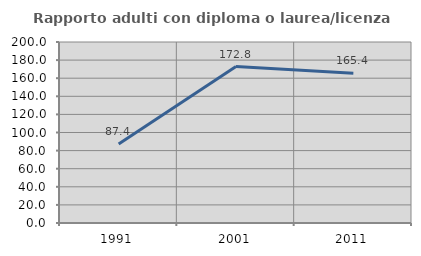
| Category | Rapporto adulti con diploma o laurea/licenza media  |
|---|---|
| 1991.0 | 87.356 |
| 2001.0 | 172.826 |
| 2011.0 | 165.421 |